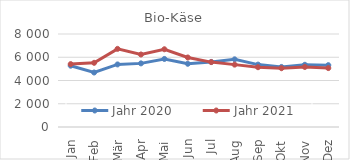
| Category | Jahr 2020 | Jahr 2021 |
|---|---|---|
| Jan | 5273.636 | 5409.747 |
| Feb | 4687.021 | 5521.187 |
| Mär | 5382.36 | 6720.549 |
| Apr | 5473.24 | 6237.466 |
| Mai | 5853.551 | 6687.425 |
| Jun | 5439.593 | 5979.395 |
| Jul | 5598.699 | 5582.656 |
| Aug | 5820.834 | 5365.761 |
| Sep | 5367.835 | 5142.908 |
| Okt | 5166.151 | 5056.425 |
| Nov | 5351.26 | 5164.791 |
| Dez | 5318.341 | 5068.452 |